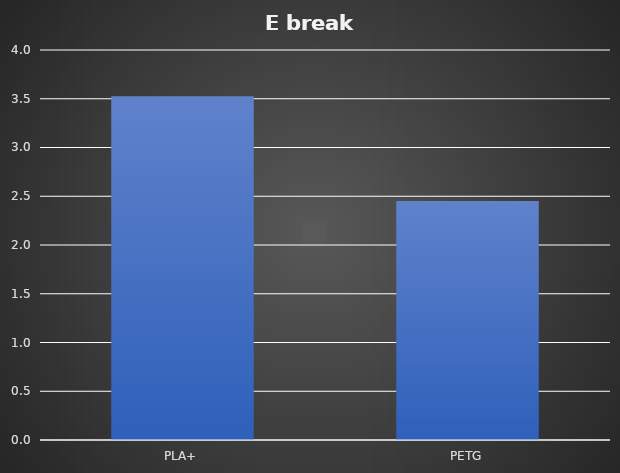
| Category | kJ/m² |
|---|---|
| PLA+ | 3.525 |
| PETG | 2.452 |